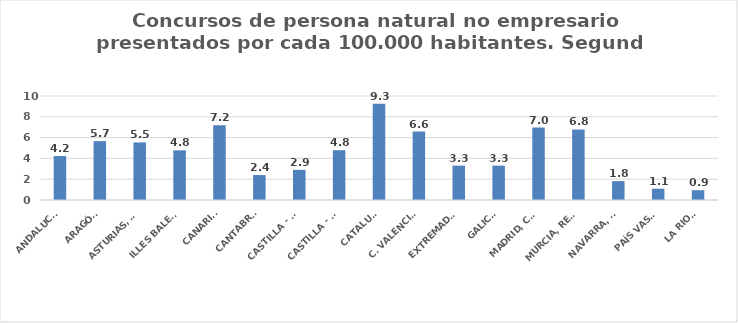
| Category | Series 0 |
|---|---|
| ANDALUCÍA | 4.227 |
| ARAGÓN | 5.659 |
| ASTURIAS, PRINCIPADO | 5.536 |
| ILLES BALEARS | 4.777 |
| CANARIAS | 7.184 |
| CANTABRIA | 2.396 |
| CASTILLA - LEÓN | 2.898 |
| CASTILLA - LA MANCHA | 4.786 |
| CATALUÑA | 9.256 |
| C. VALENCIANA | 6.575 |
| EXTREMADURA | 3.306 |
| GALICIA | 3.303 |
| MADRID, COMUNIDAD | 6.968 |
| MURCIA, REGIÓN | 6.786 |
| NAVARRA, COM. FORAL | 1.815 |
| PAÍS VASCO | 1.085 |
| LA RIOJA | 0.94 |